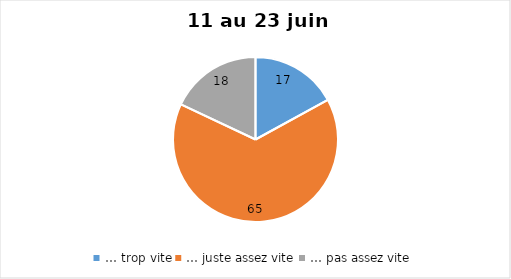
| Category | Series 0 |
|---|---|
| … trop vite | 17 |
| … juste assez vite | 65 |
| … pas assez vite | 18 |